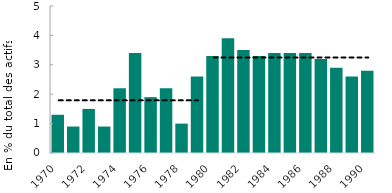
| Category | Series 0 |
|---|---|
| 1970.0 | 1.3 |
| 1971.0 | 0.9 |
| 1972.0 | 1.5 |
| 1973.0 | 0.9 |
| 1974.0 | 2.2 |
| 1975.0 | 3.4 |
| 1976.0 | 1.9 |
| 1977.0 | 2.2 |
| 1978.0 | 1 |
| 1979.0 | 2.6 |
| 1980.0 | 3.3 |
| 1981.0 | 3.9 |
| 1982.0 | 3.5 |
| 1983.0 | 3.3 |
| 1984.0 | 3.4 |
| 1985.0 | 3.4 |
| 1986.0 | 3.4 |
| 1987.0 | 3.2 |
| 1988.0 | 2.9 |
| 1989.0 | 2.6 |
| 1990.0 | 2.8 |